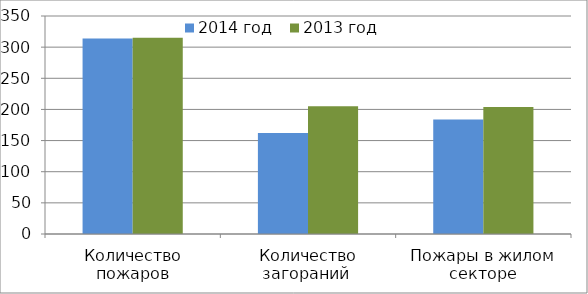
| Category | 2014 год | 2013 год |
|---|---|---|
| Количество пожаров | 314 | 315 |
| Количество загораний  | 162 | 205 |
| Пожары в жилом секторе | 184 | 204 |